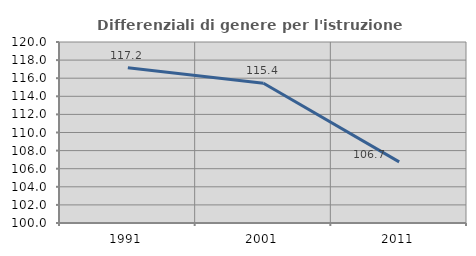
| Category | Differenziali di genere per l'istruzione superiore |
|---|---|
| 1991.0 | 117.151 |
| 2001.0 | 115.443 |
| 2011.0 | 106.749 |